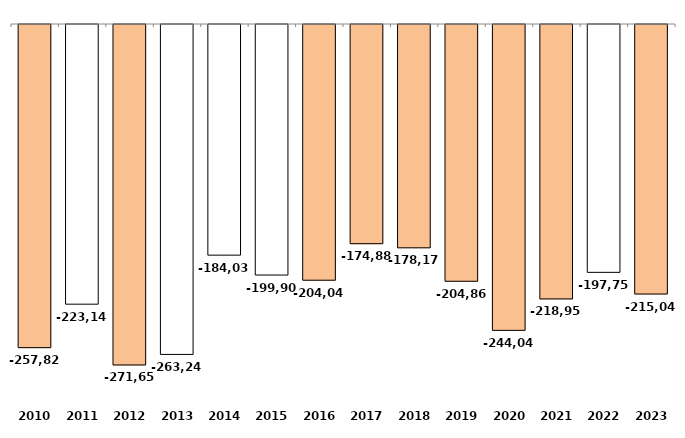
| Category | Series 0 |
|---|---|
| 2010 | -257827.95 |
| 2011 | -223143.13 |
| 2012 | -271654.36 |
| 2013 | -263243.19 |
| 2014 | -184030.53 |
| 2015 | -199902.22 |
| 2016 | -204042.78 |
| 2017 | -174880 |
| 2018 | -178169.71 |
| 2019 | -204865.08 |
| 2020 | -244044.19 |
| 2021 | -218953 |
| 2022 | -197750 |
| 2023 | -215046.995 |